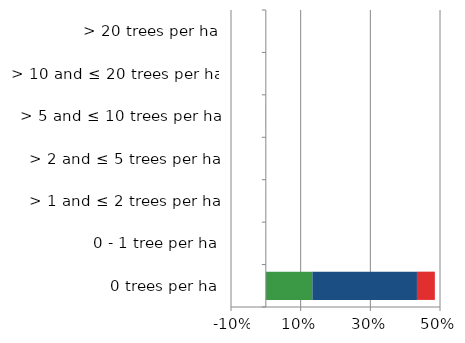
| Category | England | Scotland | Wales |
|---|---|---|---|
| 0 trees per ha | 0.134 | 0.3 | 0.051 |
| 0 - 1 tree per ha | 0 | 0 | 0 |
| > 1 and ≤ 2 trees per ha | 0 | 0 | 0 |
| > 2 and ≤ 5 trees per ha | 0 | 0 | 0 |
| > 5 and ≤ 10 trees per ha | 0 | 0 | 0 |
| > 10 and ≤ 20 trees per ha | 0 | 0 | 0 |
| > 20 trees per ha | 0 | 0 | 0 |